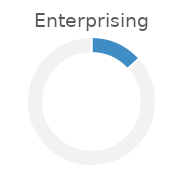
| Category | Enterprising |
|---|---|
| 0 | 0.133 |
| 1 | 0.867 |